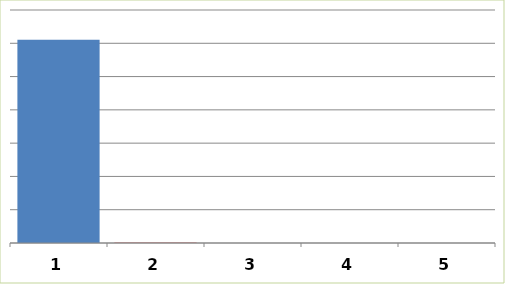
| Category | Series 0 |
|---|---|
| 0 | 3052858.4 |
| 1 | 2000 |
| 2 | 0 |
| 3 | 0 |
| 4 | 0 |